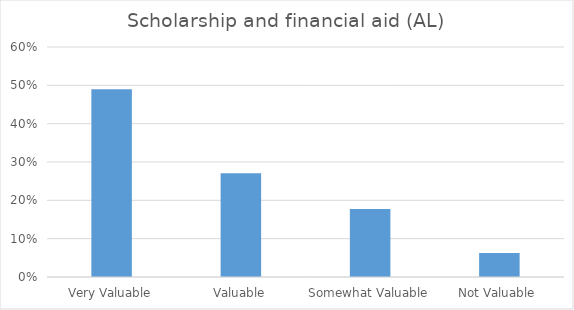
| Category | Scholarship and financial aid (AL) |
|---|---|
| Very Valuable | 0.49 |
| Valuable | 0.271 |
| Somewhat Valuable | 0.177 |
| Not Valuable | 0.062 |